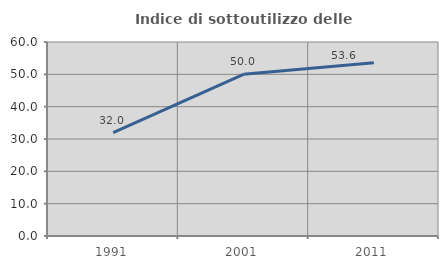
| Category | Indice di sottoutilizzo delle abitazioni  |
|---|---|
| 1991.0 | 31.959 |
| 2001.0 | 50 |
| 2011.0 | 53.6 |